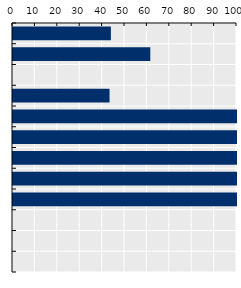
| Category | Series 0 |
|---|---|
| Korea | 43.7 |
| Japan | 61.291 |
| OECD average | 0 |
| Australia | 43.1 |
| Singapore | 100 |
| Mongolia | 100 |
| Viet Nam* | 100 |
| Malaysia* | 100 |
| Indonesia* | 100 |
| China | 0 |
| New Zealand | 0 |
| Thailand | 0 |